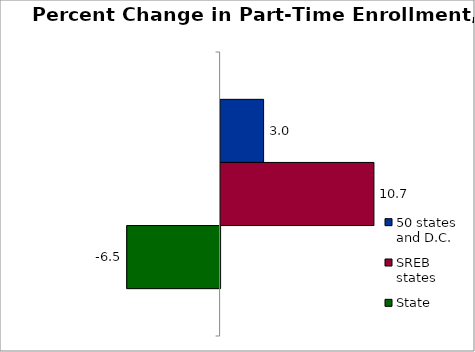
| Category | 50 states and D.C. | SREB states | State |
|---|---|---|---|
| 0 | 2.994 | 10.678 | -6.501 |